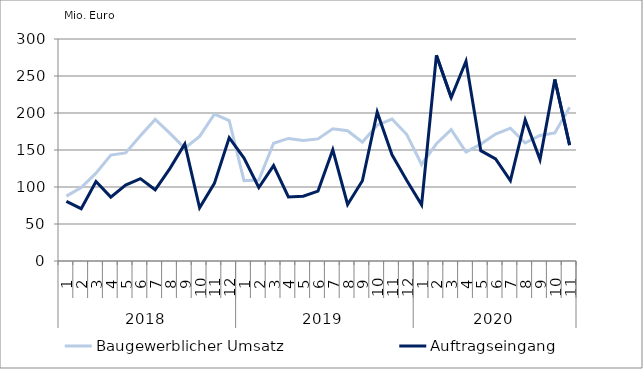
| Category | Baugewerblicher Umsatz | Auftragseingang |
|---|---|---|
| 0 | 87640.529 | 80684.627 |
| 1 | 99259.455 | 70746.763 |
| 2 | 118764.324 | 107538.747 |
| 3 | 143144.178 | 86374.619 |
| 4 | 146070.782 | 102661.329 |
| 5 | 169150.753 | 111287.709 |
| 6 | 191277.885 | 96286.662 |
| 7 | 172425.535 | 125142.495 |
| 8 | 152354.98 | 158112.302 |
| 9 | 168372.756 | 71808.619 |
| 10 | 198558.472 | 104904.147 |
| 11 | 189665.914 | 166653.461 |
| 12 | 108616.605 | 139065.287 |
| 13 | 109331.58 | 99318.609 |
| 14 | 159117.81 | 129002.041 |
| 15 | 165654.287 | 86579.2 |
| 16 | 162976.056 | 87644.362 |
| 17 | 165026.188 | 94463.186 |
| 18 | 178622.938 | 150345.08 |
| 19 | 176074.101 | 76434.317 |
| 20 | 160663.041 | 108444.162 |
| 21 | 183589.485 | 201122.697 |
| 22 | 191777.213 | 143514.792 |
| 23 | 170885.223 | 108780.022 |
| 24 | 130445.562 | 75891.481 |
| 25 | 158433.655 | 277923.85 |
| 26 | 177529.832 | 220973.626 |
| 27 | 147259.799 | 269936.091 |
| 28 | 157965.891 | 149072.895 |
| 29 | 171647.778 | 137984.76 |
| 30 | 179530.732 | 108645.965 |
| 31 | 159480.457 | 190771.468 |
| 32 | 169638.111 | 136988.906 |
| 33 | 173040.053 | 245341.603 |
| 34 | 207619.085 | 156647.224 |